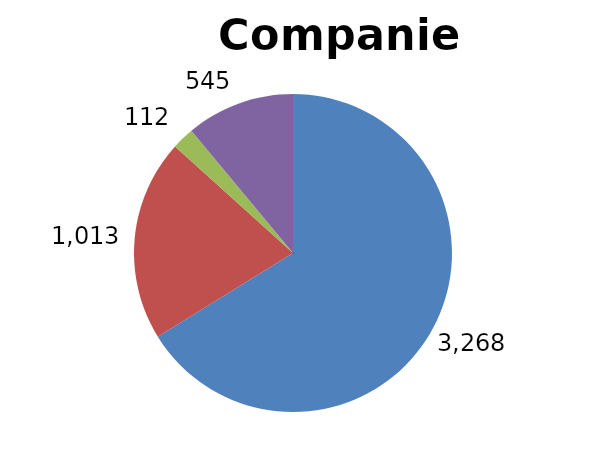
| Category | Series 0 |
|---|---|
| Medical Technology | 3268 |
| Medical Biotechnology | 1013 |
| Industrial Biotechnology | 112 |
| Pharmaceutical | 545 |